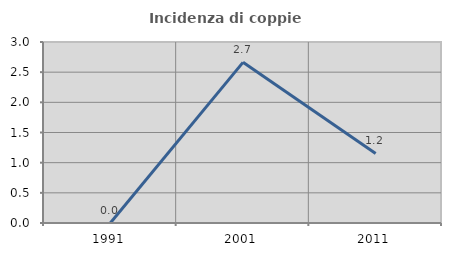
| Category | Incidenza di coppie miste |
|---|---|
| 1991.0 | 0 |
| 2001.0 | 2.663 |
| 2011.0 | 1.153 |